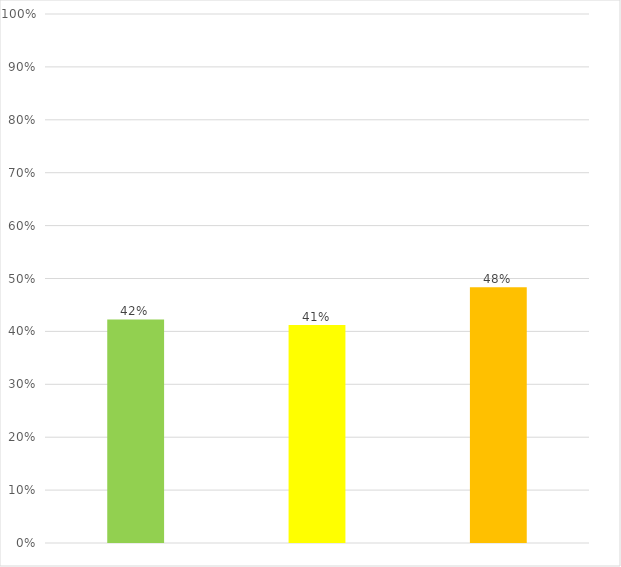
| Category | Series 0 |
|---|---|
| 0 | 0.423 |
| 1 | 0.412 |
| 2 | 0.483 |